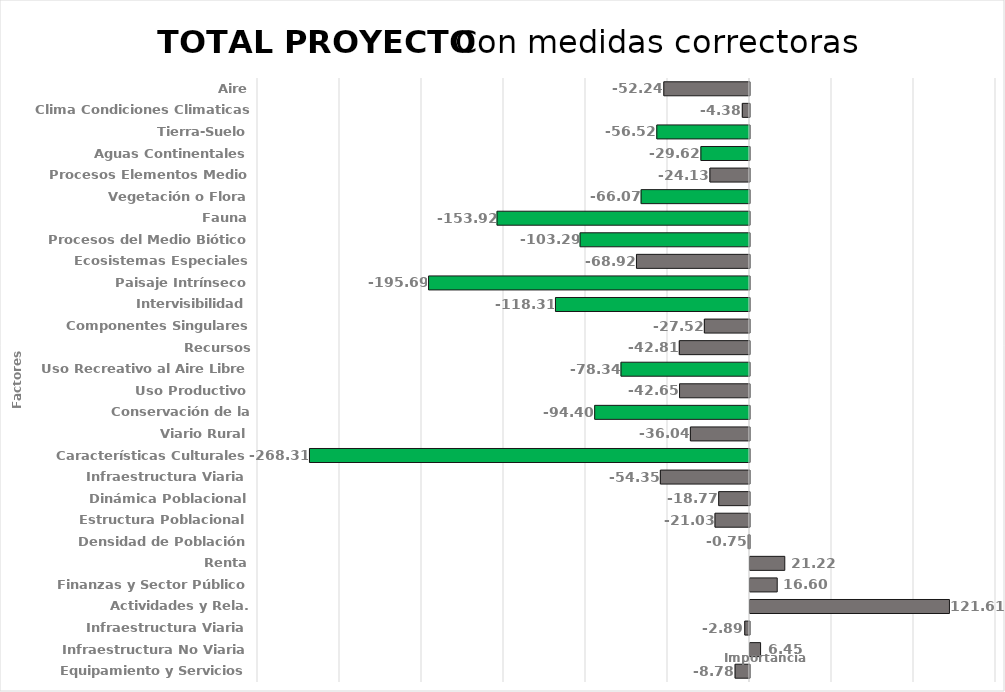
| Category | Series 0 |
|---|---|
| Aire | -52.243 |
| Clima Condiciones Climaticas | -4.378 |
| Tierra-Suelo | -56.524 |
| Aguas Continentales | -29.624 |
| Procesos Elementos Medio | -24.127 |
| Vegetación o Flora | -66.073 |
| Fauna | -153.918 |
| Procesos del Medio Biótico | -103.287 |
| Ecosistemas Especiales | -68.921 |
| Paisaje Intrínseco | -195.685 |
| Intervisibilidad | -118.312 |
| Componentes Singulares Paisaje | -27.518 |
| Recursos Científico-Culturales | -42.806 |
| Uso Recreativo al Aire Libre | -78.338 |
| Uso Productivo | -42.651 |
| Conservación de la Naturaleza | -94.397 |
| Viario Rural | -36.036 |
| Características Culturales | -268.308 |
| Infraestructura Viaria | -54.347 |
| Dinámica Poblacional | -18.775 |
| Estructura Poblacional | -21.028 |
| Densidad de Población | -0.751 |
| Renta | 21.217 |
| Finanzas y Sector Público | 16.6 |
| Actividades y Rela. Económicas | 121.611 |
| Infraestructura Viaria | -2.888 |
| Infraestructura No Viaria | 6.455 |
| Equipamiento y Servicios | -8.776 |